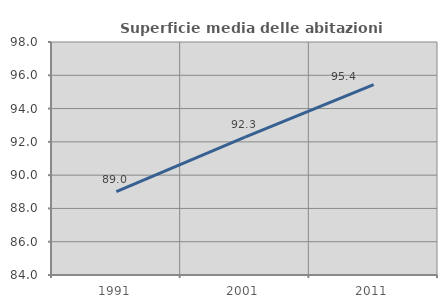
| Category | Superficie media delle abitazioni occupate |
|---|---|
| 1991.0 | 89.016 |
| 2001.0 | 92.288 |
| 2011.0 | 95.439 |